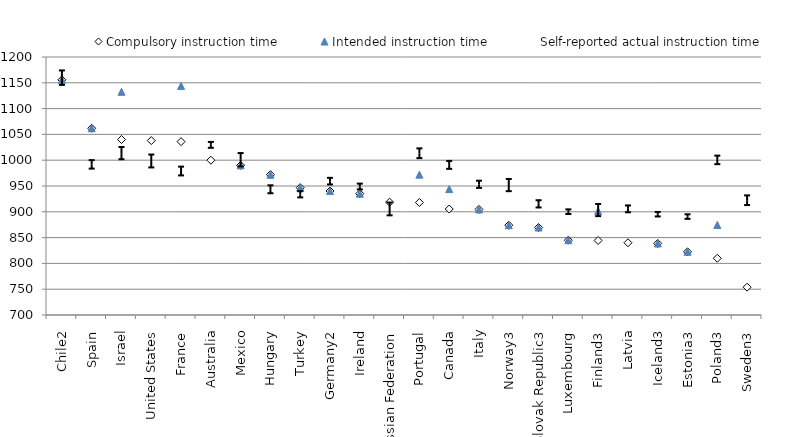
| Category | Compulsory instruction time | Intended instruction time | Self-reported actual instruction time |
|---|---|---|---|
| Chile2 | 1155.75 | 1155.75 | 1159.958 |
| Spain | 1061.93 | 1061.93 | 991.919 |
| Israel | 1040.139 | 1132.592 | 1013.753 |
| United States | 1038 | 0 | 998.49 |
| France | 1036 | 1144 | 979.026 |
| Australia | 1000 | 0 | 1029.72 |
| Mexico | 990 | 990 | 1000.896 |
| Hungary | 972 | 972 | 943.655 |
| Turkey | 946.8 | 946.8 | 933.96 |
| Germany2 | 940.265 | 940.265 | 959.415 |
| Ireland | 935.2 | 935.2 | 949.05 |
| Russian Federation | 918.75 | 0 | 905.57 |
| Portugal | 918 | 972 | 1013.476 |
| Canada | 905.371 | 944.062 | 990.906 |
| Italy | 904.646 | 904.646 | 953.297 |
| Norway3 | 874 | 874 | 951.81 |
| Slovak Republic3 | 869.55 | 869.55 | 915.424 |
| Luxembourg | 845 | 845 | 900.226 |
| Finland3 | 844.392 | 901.392 | 903.392 |
| Latvia | 840 | 0 | 905.705 |
| Iceland3 | 838.667 | 838.667 | 895.314 |
| Estonia3 | 822.5 | 822.5 | 890.74 |
| Poland3 | 810 | 874.5 | 1000.601 |
| Sweden3 | 753.889 | 0 | 922.432 |